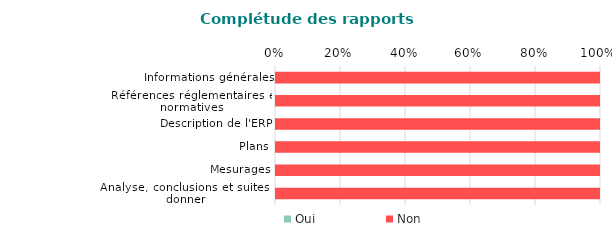
| Category | Oui | Non |
|---|---|---|
| Informations générales | 0 | 1 |
| Références réglementaires et normatives | 0 | 1 |
| Description de l'ERP | 0 | 1 |
| Plans | 0 | 1 |
| Mesurages | 0 | 1 |
| Analyse, conclusions et suites à donner | 0 | 1 |